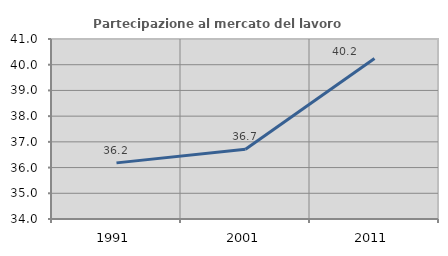
| Category | Partecipazione al mercato del lavoro  femminile |
|---|---|
| 1991.0 | 36.183 |
| 2001.0 | 36.711 |
| 2011.0 | 40.245 |